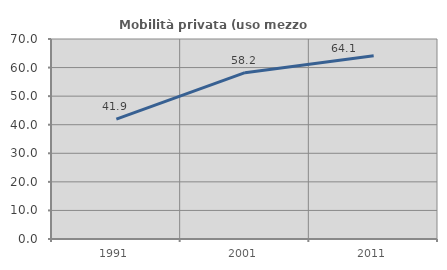
| Category | Mobilità privata (uso mezzo privato) |
|---|---|
| 1991.0 | 41.942 |
| 2001.0 | 58.207 |
| 2011.0 | 64.104 |